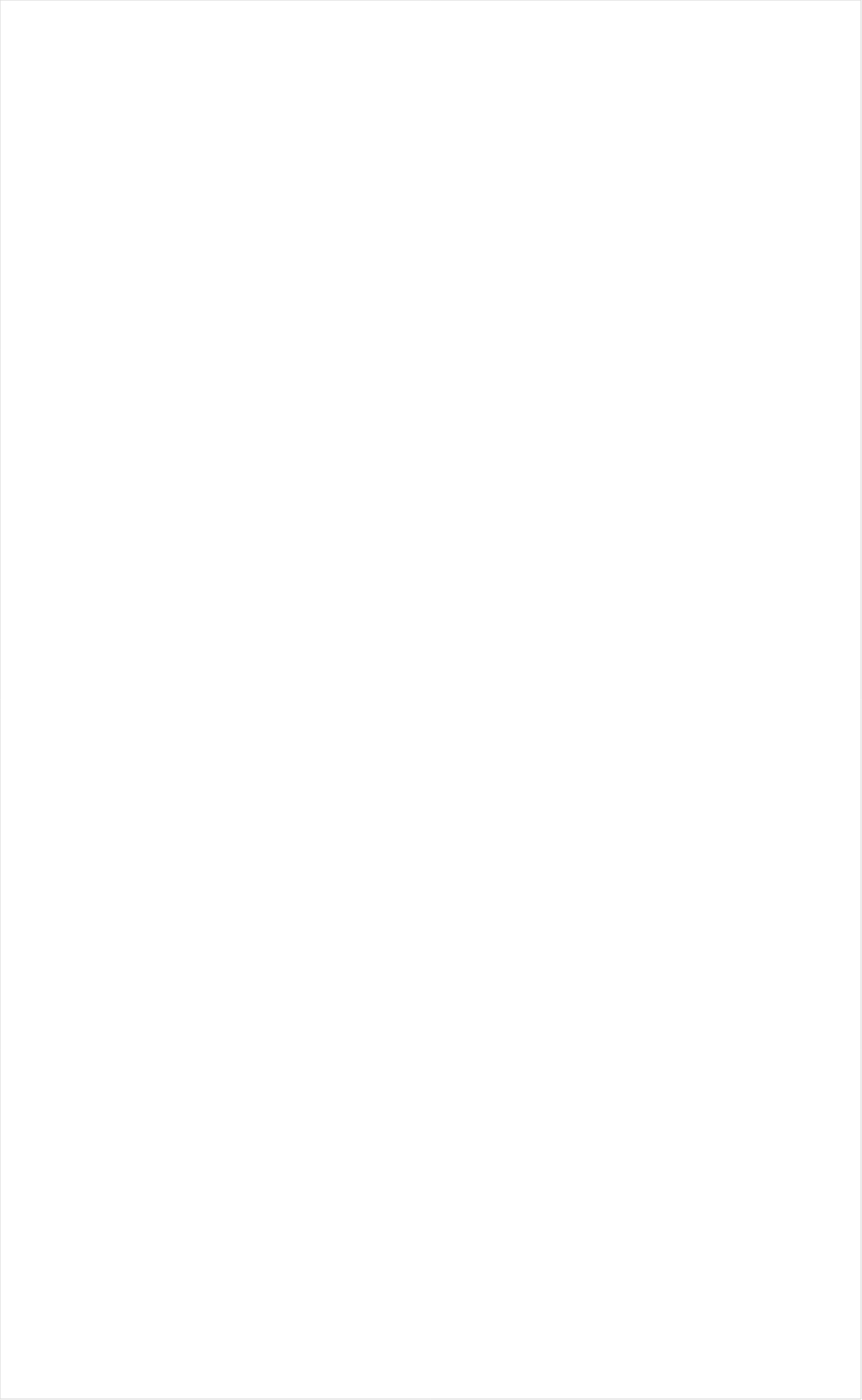
| Category | Total |
|---|---|
| PAC-12 Network | -0.246 |
| RFD TV | -0.238 |
| Fox Business | -0.199 |
| PBS | -0.191 |
| Hallmark Movies & Mysteries | -0.189 |
| Smithsonian | -0.167 |
| MSNBC | -0.166 |
| CBS Sports | -0.16 |
| INSP | -0.147 |
| Science Channel | -0.142 |
| Fox News | -0.142 |
| Big Ten Network | -0.134 |
| SundanceTV | -0.133 |
| National Geographic Wild | -0.126 |
| CBS | -0.114 |
| Hallmark | -0.113 |
| NHL | -0.108 |
| NBC | -0.097 |
| DIY | -0.096 |
| CNN | -0.096 |
| NBC Sports | -0.095 |
| Destination America | -0.093 |
| Great American Country | -0.09 |
| History Channel | -0.088 |
| American Heroes Channel | -0.085 |
| BBC America | -0.083 |
| Game Show | -0.078 |
| Motor Trend Network | -0.07 |
| Weather Channel | -0.07 |
| Investigation Discovery | -0.069 |
| Outdoor Channel | -0.068 |
| HGTV | -0.068 |
| Bloomberg HD | -0.066 |
| ABC | -0.066 |
| ESPNU | -0.062 |
| CW | -0.061 |
| FXDEP | -0.061 |
| Olympic Channel | -0.06 |
| TV LAND | -0.059 |
| Headline News | -0.057 |
| Ovation | -0.057 |
| Reelz Channel | -0.054 |
| Cooking Channel | -0.051 |
| BET Her | -0.05 |
| Animal Planet | -0.049 |
| National Geographic | -0.048 |
| WGN America | -0.047 |
| FYI | -0.047 |
| POP | -0.046 |
| Golf | -0.045 |
| ION | -0.044 |
| Independent Film (IFC) | -0.044 |
| Travel | -0.044 |
| Oprah Winfrey Network | -0.039 |
| Fox Sports 1 | -0.036 |
| FOX | -0.036 |
| OXYGEN | -0.034 |
| Logo | -0.033 |
| Discovery Channel | -0.033 |
| CMTV | -0.025 |
| Food Network | -0.024 |
| FX Movie Channel | -0.024 |
| AMC | -0.019 |
| UP TV | -0.015 |
| Paramount Network | -0.005 |
| The Sportsman Channel | 0.003 |
| TBS | 0.007 |
| MLB Network | 0.008 |
| WE TV | 0.009 |
| A&E | 0.011 |
| Viceland | 0.011 |
| Lifetime | 0.012 |
| ESPNEWS | 0.012 |
| TLC | 0.017 |
| CNBC | 0.023 |
| NFL Network | 0.025 |
| SYFY | 0.026 |
| NBA TV | 0.026 |
| BRAVO | 0.027 |
| FOX Sports 2 | 0.028 |
| USA Network | 0.029 |
| Discovery Family Channel | 0.029 |
| TNT | 0.031 |
| Tennis Channel | 0.045 |
| E! | 0.047 |
| ESPN Deportes | 0.06 |
| ESPN | 0.064 |
| Lifetime Movies | 0.065 |
| ESPN2 | 0.066 |
| TV ONE | 0.074 |
| FX | 0.084 |
| Comedy Central | 0.087 |
| MyNetworkTV | 0.09 |
| FXX | 0.092 |
| Disney Channel | 0.098 |
| truTV | 0.109 |
| Disney XD | 0.114 |
| BET | 0.121 |
| Discovery Life Channel | 0.122 |
| Cartoon Network | 0.123 |
| Nick@Nite | 0.131 |
| Freeform | 0.135 |
| Nick Toons | 0.151 |
| Teen Nick | 0.154 |
| Nick | 0.173 |
| Galavision | 0.173 |
| Univision | 0.193 |
| MTV | 0.193 |
| NBC Universo | 0.199 |
| Adult Swim | 0.203 |
| VH1 | 0.208 |
| UniMas | 0.215 |
| Universal Kids | 0.222 |
| Telemundo | 0.233 |
| MTV2 | 0.234 |
| Disney Junior US | 0.321 |
| Nick Jr. | 0.324 |
| TUDN | 0.334 |